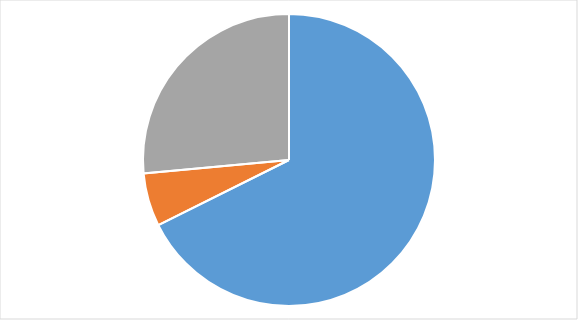
| Category | Series 0 |
|---|---|
| Before the visit | 0.676 |
| At the visit or after visit - no visitors report | 0.059 |
| After visitors report sent to education provider | 0.265 |